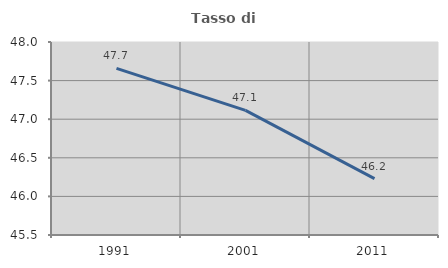
| Category | Tasso di occupazione   |
|---|---|
| 1991.0 | 47.659 |
| 2001.0 | 47.115 |
| 2011.0 | 46.231 |